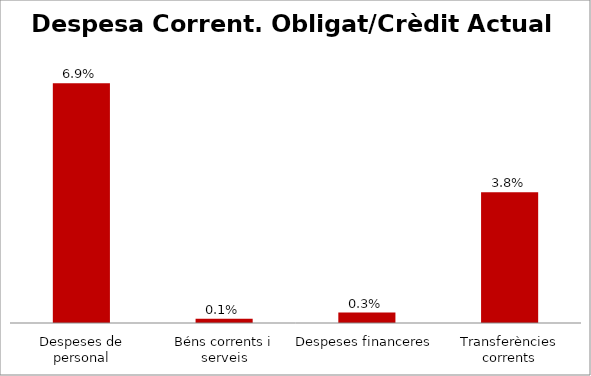
| Category | Series 0 |
|---|---|
| Despeses de personal | 0.069 |
| Béns corrents i serveis | 0.001 |
| Despeses financeres | 0.003 |
| Transferències corrents | 0.038 |